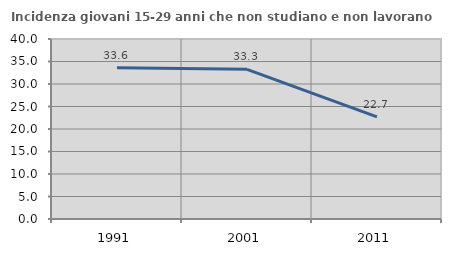
| Category | Incidenza giovani 15-29 anni che non studiano e non lavorano  |
|---|---|
| 1991.0 | 33.594 |
| 2001.0 | 33.255 |
| 2011.0 | 22.694 |